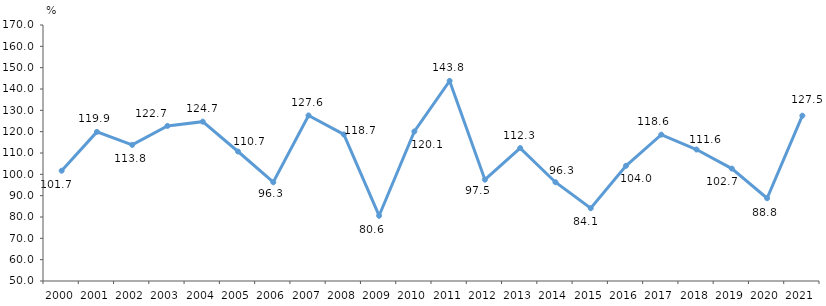
| Category | EXPORT |
|---|---|
| 2000.0 | 101.7 |
| 2001.0 | 119.9 |
| 2002.0 | 113.8 |
| 2003.0 | 122.7 |
| 2004.0 | 124.7 |
| 2005.0 | 110.7 |
| 2006.0 | 96.3 |
| 2007.0 | 127.6 |
| 2008.0 | 118.7 |
| 2009.0 | 80.6 |
| 2010.0 | 120.1 |
| 2011.0 | 143.8 |
| 2012.0 | 97.5 |
| 2013.0 | 112.3 |
| 2014.0 | 96.3 |
| 2015.0 | 84.1 |
| 2016.0 | 104 |
| 2017.0 | 118.6 |
| 2018.0 | 111.626 |
| 2019.0 | 102.7 |
| 2020.0 | 88.8 |
| 2021.0 | 127.5 |